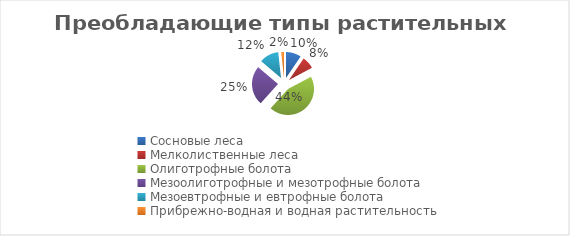
| Category | Series 0 |
|---|---|
| Сосновые леса | 9.5 |
| Мелколиственные леса | 7.7 |
| Олиготрофные болота | 44.4 |
| Мезоолиготрофные и мезотрофные болота | 24.5 |
| Мезоевтрофные и евтрофные болота | 12.1 |
| Прибрежно-водная и водная растительность | 1.7 |